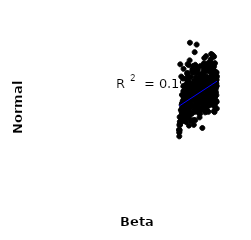
| Category | Series 0 |
|---|---|
| 36.957838073041316 | 774.494 |
| 36.73413787801686 | 627.892 |
| 40.55856776338242 | 749.544 |
| 40.180085610158194 | 779.877 |
| 40.958273129341016 | 832.307 |
| 36.17791340856428 | 646.233 |
| 38.91952385559631 | 577.009 |
| 43.84278715932486 | 740.854 |
| 37.82754029690867 | 639.082 |
| 41.71167236618707 | 674.128 |
| 40.65168179243187 | 740.859 |
| 43.09383148274357 | 726.689 |
| 42.837786823031756 | 778.202 |
| 40.18519002420041 | 654.74 |
| 39.76807695686399 | 609.296 |
| 39.95744905162754 | 718.578 |
| 41.95952358728956 | 648.875 |
| 42.38350325606751 | 707.442 |
| 40.410171363998145 | 788.634 |
| 41.928678543299924 | 744.595 |
| 40.57490333071664 | 674.608 |
| 40.78264026855993 | 734.386 |
| 43.22240591808958 | 631.546 |
| 35.93085898994363 | 643.633 |
| 38.446868280218666 | 857.381 |
| 43.50093430712034 | 727.508 |
| 41.80589098052988 | 704.56 |
| 36.60699470289444 | 628.615 |
| 36.247578561825705 | 657.765 |
| 40.74322138529889 | 697.331 |
| 39.62462825044211 | 663.845 |
| 39.40186644996382 | 753.634 |
| 41.86368607038498 | 579.779 |
| 37.595187947633555 | 891.676 |
| 39.715718838031705 | 614.426 |
| 36.38535866817008 | 541.601 |
| 40.14550794265751 | 856.465 |
| 35.902136657581146 | 552.156 |
| 41.16087466072507 | 654.455 |
| 37.248004167421975 | 687.217 |
| 37.66366518820395 | 999.563 |
| 41.36395450851588 | 573.206 |
| 40.69995918218085 | 718.231 |
| 38.22626948247785 | 692.555 |
| 41.711262308393344 | 665.877 |
| 42.20446371780627 | 613.667 |
| 37.38174490166034 | 862.778 |
| 37.84849338162252 | 738.433 |
| 43.501139959556156 | 750.719 |
| 37.35532458997686 | 551.413 |
| 39.54554478553708 | 834.441 |
| 43.19364282260736 | 663.537 |
| 38.07344216028033 | 749.045 |
| 43.72602675306581 | 733.985 |
| 42.26281651988968 | 676.805 |
| 42.853242216992044 | 734.247 |
| 42.08686120713884 | 825.522 |
| 42.695946991545995 | 683.137 |
| 37.078905005514535 | 814.492 |
| 42.32202676522556 | 729.429 |
| 37.79908419609508 | 669.674 |
| 39.445187749616906 | 735.844 |
| 43.62511823976846 | 667.926 |
| 35.16612879453058 | 499.237 |
| 36.620692616564995 | 665.543 |
| 38.687951451675765 | 830.56 |
| 43.400574914489724 | 812.123 |
| 38.643275176726675 | 691.127 |
| 37.12778827986923 | 709.698 |
| 36.44110630338175 | 612.051 |
| 41.36133583780589 | 741.121 |
| 37.964386779647114 | 562.684 |
| 38.25613266062817 | 714.434 |
| 35.09857129326781 | 466.673 |
| 39.577076577856026 | 700.037 |
| 36.977179848253066 | 669.985 |
| 39.095406659760854 | 631.91 |
| 44.03596446149483 | 643.774 |
| 42.84728195547852 | 633.641 |
| 41.893246390846414 | 644.787 |
| 40.39122651225615 | 654.773 |
| 43.417925402938025 | 832.536 |
| 43.34304917991875 | 700.417 |
| 41.257063927349115 | 667.228 |
| 42.20296408429495 | 849.463 |
| 37.5606226127974 | 657.965 |
| 40.16285571312524 | 747.171 |
| 43.05105210022031 | 619.642 |
| 39.310221721741215 | 677.282 |
| 42.754332421388554 | 818.721 |
| 38.21349018373465 | 711.397 |
| 43.279692380467175 | 740.291 |
| 43.109570567192236 | 653.709 |
| 37.68767647339638 | 754.305 |
| 43.860487166727474 | 729.745 |
| 43.88926938095051 | 757.984 |
| 36.07687476577011 | 703.245 |
| 43.27101235657523 | 658.937 |
| 41.32845079008771 | 649.112 |
| 39.185688317343896 | 644.377 |
| 38.938192650050254 | 669.954 |
| 40.553779354186624 | 749.416 |
| 35.084506204178616 | 448.77 |
| 41.065811990725344 | 755.817 |
| 42.58109035451129 | 781.876 |
| 39.50749853040549 | 772.189 |
| 38.42885732995284 | 817.153 |
| 39.700170836528315 | 653.509 |
| 40.70650418900333 | 691.69 |
| 37.422526972471566 | 491.987 |
| 43.33775738385186 | 800.377 |
| 39.26507702606579 | 636.303 |
| 37.76481509458541 | 689.779 |
| 41.273207941223596 | 855.255 |
| 42.96571382659635 | 791.736 |
| 39.434476384039534 | 819.547 |
| 36.6832251713813 | 584.841 |
| 42.03529480709012 | 686.007 |
| 38.40591013754763 | 655.153 |
| 40.583010636178905 | 673.947 |
| 36.384228126464805 | 737.296 |
| 36.423707491929015 | 550.042 |
| 43.86231853960876 | 734.275 |
| 37.25367391953498 | 556.562 |
| 39.10414021016505 | 789.173 |
| 38.3174971103948 | 675.672 |
| 40.16398626845907 | 762.114 |
| 36.124016948462845 | 839.773 |
| 38.93383357961649 | 525.405 |
| 37.17326794987309 | 612.782 |
| 40.66233721994436 | 477.639 |
| 42.68699682000165 | 711.702 |
| 39.741518489608076 | 667.912 |
| 36.51619533290319 | 637.304 |
| 41.78350824826111 | 583.617 |
| 39.10395621850005 | 607.273 |
| 41.73762787242122 | 691.306 |
| 39.19131791170026 | 751.661 |
| 42.18746657503842 | 747.216 |
| 41.558783757799816 | 696.586 |
| 44.05955513441707 | 677.868 |
| 42.44305048086967 | 882.705 |
| 37.9046803200867 | 623.583 |
| 37.037379389517895 | 603.983 |
| 41.29657243779511 | 661.585 |
| 36.63983131330514 | 736.321 |
| 44.093140727760144 | 817.4 |
| 41.9657401717641 | 773.498 |
| 38.1188367105444 | 656.526 |
| 35.28787278225834 | 497.551 |
| 42.561968679492225 | 733.077 |
| 35.91639709516671 | 586.655 |
| 43.7395142036737 | 667.16 |
| 40.700109238834926 | 675.271 |
| 37.19531667962378 | 567.929 |
| 42.96948867341759 | 810.687 |
| 41.31969945127589 | 653.032 |
| 42.53526982475266 | 850.383 |
| 41.208225459473475 | 731.298 |
| 39.91982173929158 | 782.763 |
| 36.95001768365364 | 686.715 |
| 37.16790528292376 | 776.412 |
| 39.88759164061399 | 586.604 |
| 40.788272044372654 | 644.011 |
| 43.8338791309893 | 760.35 |
| 35.60829604435241 | 543.132 |
| 35.46754735725728 | 587.637 |
| 40.79238243730751 | 696.71 |
| 43.606053728029586 | 574.746 |
| 39.2127507783719 | 735.577 |
| 38.720608072804644 | 605.448 |
| 37.29126077668024 | 724.469 |
| 39.942968349386845 | 674.062 |
| 42.52943282383599 | 636.12 |
| 37.154865246399694 | 570.348 |
| 41.42546195920174 | 725.945 |
| 37.153816391150514 | 802.673 |
| 37.476638611729584 | 721.067 |
| 41.7779588634302 | 790.513 |
| 40.63193618243059 | 672.364 |
| 35.13236429062151 | 457.082 |
| 38.810937724919675 | 941.723 |
| 38.57755100119899 | 527.344 |
| 43.32554792547313 | 864.962 |
| 41.06254943572123 | 662.084 |
| 42.846610128277845 | 746.066 |
| 38.53410425988763 | 721.818 |
| 36.974595999913035 | 752.023 |
| 44.014643358371636 | 783.203 |
| 40.01799984025999 | 681.542 |
| 38.92946891204099 | 665.741 |
| 36.16757969882796 | 571.975 |
| 40.14450471943479 | 696.818 |
| 39.2568000503387 | 662.382 |
| 43.312206651774574 | 720.726 |
| 37.460430276060144 | 537.299 |
| 36.746680296313215 | 589.042 |
| 36.099309598903005 | 567.602 |
| 41.16087993764492 | 675.074 |
| 40.88251706623713 | 862.497 |
| 37.76269095202199 | 571.774 |
| 37.416489296872854 | 587.584 |
| 40.9725038764539 | 817.516 |
| 41.708121783878504 | 760.985 |
| 41.59031948621275 | 702.401 |
| 38.34750636862993 | 648.697 |
| 35.33240381014199 | 867.416 |
| 36.27314864190615 | 570.827 |
| 42.66549468693245 | 897.256 |
| 36.51448076311155 | 584.898 |
| 42.62910032551689 | 634.957 |
| 36.62579998897557 | 565.057 |
| 42.40922306419261 | 837.575 |
| 42.856202925074456 | 765.606 |
| 40.58431964127533 | 742.831 |
| 40.18865109772507 | 721.386 |
| 36.66952480707237 | 780.012 |
| 36.18042958356092 | 734.544 |
| 40.55004272578994 | 648.618 |
| 42.87108154537655 | 735.517 |
| 37.213463274737244 | 539.553 |
| 41.41364023965251 | 845.991 |
| 39.31603363888584 | 652.393 |
| 35.992384784110165 | 780.476 |
| 35.15316411420964 | 493.667 |
| 41.00060597158744 | 872.79 |
| 38.7160348121657 | 692 |
| 35.089860264327406 | 467.844 |
| 35.223943175047516 | 516.821 |
| 42.65273011189676 | 675.409 |
| 40.201569557779955 | 631.024 |
| 41.194768617926506 | 593.53 |
| 35.96843821765967 | 678.663 |
| 39.194455613693485 | 748.485 |
| 36.03597591531286 | 574.97 |
| 41.75852689397796 | 860.765 |
| 40.43285893417104 | 603.823 |
| 43.443890856757996 | 740.843 |
| 42.30603220977778 | 751.364 |
| 41.04536497741496 | 727.513 |
| 41.965006232943395 | 747.278 |
| 40.886327663803115 | 755.013 |
| 42.531829060015724 | 845.44 |
| 36.374304787207315 | 652.225 |
| 37.48340666101596 | 632.931 |
| 38.86575438093225 | 736.594 |
| 42.02952365795702 | 773.116 |
| 36.10177689344006 | 556.603 |
| 39.15058847344311 | 760.28 |
| 40.29807240309161 | 661.502 |
| 41.503697955380275 | 767.455 |
| 36.13526133009367 | 549.651 |
| 39.28506548119767 | 988.175 |
| 40.80478731117977 | 615.738 |
| 39.04268234993979 | 613.869 |
| 37.95012314623806 | 517.534 |
| 42.80049688232977 | 930.803 |
| 39.99276041857476 | 542.414 |
| 43.62434137087912 | 716.353 |
| 42.40759314116866 | 700.357 |
| 41.21159412302564 | 631.881 |
| 40.93394676624756 | 768.099 |
| 43.14649363037415 | 924.513 |
| 41.162884194382755 | 778.839 |
| 40.77592528839903 | 714.059 |
| 37.19962428986178 | 722.913 |
| 40.478944654899756 | 797.989 |
| 36.86805202187786 | 708.578 |
| 43.87903743642583 | 713.062 |
| 39.40935145984685 | 812.34 |
| 43.96074934152868 | 695.603 |
| 37.10899881274693 | 868.714 |
| 43.28157453439342 | 913.936 |
| 35.73526863832421 | 629.062 |
| 43.27090948276141 | 838.375 |
| 37.787680796917996 | 664.585 |
| 38.89894763942761 | 772.339 |
| 40.18987665102994 | 800.776 |
| 36.556891585703674 | 575.545 |
| 36.85484988908901 | 606.787 |
| 39.49126731302464 | 691.156 |
| 42.66688218243022 | 666.959 |
| 39.15684240884471 | 679.121 |
| 43.23152288674697 | 730.606 |
| 40.858531232541665 | 805.703 |
| 36.18585953261664 | 602.156 |
| 41.729715945428886 | 689.497 |
| 41.765913894320114 | 850.166 |
| 37.847923943048954 | 788.646 |
| 44.052625587353305 | 749.837 |
| 39.347121806756576 | 618.559 |
| 42.26311650927357 | 729.533 |
| 42.058312724870504 | 750.031 |
| 38.02183196460667 | 677.174 |
| 40.621652290466095 | 598.592 |
| 41.31538164959549 | 732.555 |
| 39.92605817163807 | 641.086 |
| 42.39890016498693 | 661.474 |
| 41.78777910905401 | 871.347 |
| 37.08217284277248 | 654.519 |
| 42.91339221608896 | 839.613 |
| 40.95255859168638 | 803.46 |
| 40.781108262048015 | 728.291 |
| 41.35390839400636 | 618.157 |
| 38.71355791120979 | 591.699 |
| 36.39051326236668 | 595.946 |
| 38.15928524511432 | 697.039 |
| 39.81115357078941 | 625.777 |
| 39.8710296785751 | 669.551 |
| 43.805281659664004 | 594.039 |
| 36.30635297971046 | 640.585 |
| 40.680404410671116 | 648.5 |
| 41.351782308806236 | 851.169 |
| 39.86010007211192 | 710.1 |
| 42.2332638796498 | 728.089 |
| 42.84167056893278 | 743.419 |
| 39.370037889318645 | 742.616 |
| 36.00223314718096 | 551.183 |
| 43.8210684801004 | 725.84 |
| 41.81557184236503 | 612.441 |
| 39.75530177375035 | 704.463 |
| 36.25112302214021 | 662.149 |
| 39.45582345377201 | 583.002 |
| 41.463997448935714 | 661.183 |
| 39.2201067523091 | 722.885 |
| 37.365249410976155 | 664.516 |
| 35.89775067429996 | 587.468 |
| 36.641790512531905 | 550.668 |
| 40.36208197394835 | 665.184 |
| 41.86775087133227 | 732.93 |
| 41.558952716743065 | 917.451 |
| 43.43836550009181 | 579.844 |
| 43.878033534679815 | 750.519 |
| 41.03397429943303 | 673.134 |
| 35.18244373422037 | 544.928 |
| 43.807478469250576 | 683.617 |
| 35.58471551093807 | 533.754 |
| 39.876874201667384 | 665.896 |
| 44.00874341549239 | 783.719 |
| 36.01920203644587 | 594.925 |
| 35.66337179368971 | 619.169 |
| 38.609470589644026 | 719.866 |
| 39.28130895543983 | 631.341 |
| 37.925384658106346 | 613.549 |
| 43.192652999140776 | 775.591 |
| 38.28056620496834 | 569.899 |
| 38.83696736111568 | 677.051 |
| 36.837208959794154 | 558.564 |
| 40.07659082994325 | 563.24 |
| 42.89833970253272 | 707.722 |
| 42.317612505034 | 665.396 |
| 38.24220724191534 | 692.565 |
| 44.109593458658246 | 771.771 |
| 37.7326762385958 | 623.327 |
| 42.79833435351747 | 663.21 |
| 41.54307260545026 | 632.449 |
| 40.58694263405149 | 591.912 |
| 39.76735635082342 | 649.038 |
| 36.09900045715171 | 732.309 |
| 41.08657606026061 | 708.554 |
| 43.694910863546305 | 772.433 |
| 40.99550304476273 | 776.419 |
| 36.16331964904035 | 520.594 |
| 43.69900852349506 | 610.292 |
| 38.92141515215531 | 643.75 |
| 37.66401084199093 | 602.192 |
| 35.69203494009881 | 573.751 |
| 36.164823397726266 | 660.94 |
| 43.323322505252285 | 705.351 |
| 41.947382618847854 | 651.338 |
| 43.143806226402766 | 818.416 |
| 41.13543111299146 | 906.047 |
| 42.14165312766336 | 576.719 |
| 38.526977667770254 | 655.163 |
| 41.408937119112146 | 714.266 |
| 39.99325757371059 | 746.308 |
| 38.266840530751686 | 727.886 |
| 40.5537030056818 | 702.676 |
| 36.719996873468794 | 615.983 |
| 35.72992524381144 | 680.2 |
| 42.321869233915244 | 839.719 |
| 41.14379721877225 | 773.679 |
| 38.573383116048944 | 718.041 |
| 35.81257150133184 | 562.331 |
| 44.18805151854089 | 794.064 |
| 43.6797849932851 | 806.154 |
| 43.55947231710517 | 720.993 |
| 43.130438031133764 | 830.224 |
| 38.28224873420545 | 842.209 |
| 43.22200671928573 | 844.773 |
| 42.78812932834071 | 690.453 |
| 41.22415380022831 | 781.618 |
| 42.900252513903936 | 740.002 |
| 41.32277582357729 | 823.323 |
| 38.849423694290955 | 646.768 |
| 38.581413791570576 | 653.817 |
| 40.28478218038936 | 717.624 |
| 39.36931545209403 | 635.865 |
| 36.98454347820279 | 811.713 |
| 41.232361681756196 | 596.286 |
| 39.60038106010151 | 747.702 |
| 39.98605558731978 | 768.339 |
| 41.93565410060808 | 640.838 |
| 42.259507432045524 | 705.535 |
| 39.9130535903258 | 709.829 |
| 41.8263616259828 | 723.819 |
| 38.60491693859662 | 496.585 |
| 40.681693550612366 | 682.084 |
| 42.383266560810604 | 678.617 |
| 35.57347677385161 | 792.385 |
| 38.67173868216426 | 748.339 |
| 38.909690419307864 | 619.136 |
| 35.85967478539807 | 547.179 |
| 40.06598176465941 | 748.99 |
| 43.20470494439777 | 692.09 |
| 44.126870223039674 | 637 |
| 38.975196216137114 | 687.709 |
| 43.945726314471656 | 724.995 |
| 41.55976607366692 | 731.806 |
| 39.37247327353849 | 851.081 |
| 39.1803776329904 | 675.662 |
| 37.17212577502679 | 650.772 |
| 37.2172738677955 | 713.472 |
| 40.52996990641054 | 663.265 |
| 38.34989482192138 | 815.863 |
| 35.125556692194955 | 465.59 |
| 42.41658098123786 | 751.727 |
| 35.90186187328552 | 552.696 |
| 41.148233167304745 | 847.965 |
| 37.02850423456617 | 596.975 |
| 38.95133823460322 | 864.616 |
| 37.371411843519965 | 589.289 |
| 39.80095117701015 | 569.434 |
| 38.65871117381025 | 698.469 |
| 42.30478038013842 | 662.487 |
| 40.29995474971123 | 711.213 |
| 36.76630216787203 | 513.431 |
| 43.047389400408974 | 679.798 |
| 36.522990141082445 | 625.459 |
| 44.15237633891907 | 596.245 |
| 38.223115638190556 | 828.762 |
| 35.79360550569079 | 566.411 |
| 43.59553857870975 | 646.103 |
| 43.704193613643355 | 627.256 |
| 36.73949242327851 | 595.264 |
| 40.10579839970176 | 579.893 |
| 44.14289730049567 | 734.505 |
| 36.12280311085328 | 559.954 |
| 42.1290889535109 | 635.887 |
| 40.22343304259084 | 676.062 |
| 39.604195654410105 | 655.631 |
| 38.242556425333525 | 723.488 |
| 35.77699188127955 | 600.447 |
| 35.78091741934094 | 590.96 |
| 42.59182420832607 | 791.168 |
| 37.24540110262415 | 661.677 |
| 42.48749453754079 | 663.165 |
| 40.050666257758934 | 746.317 |
| 39.45745436744805 | 646.839 |
| 40.7888774821357 | 632.759 |
| 43.5005752114782 | 914.545 |
| 42.907174930858574 | 772.681 |
| 43.03609425294558 | 691.481 |
| 39.49210367921679 | 727.042 |
| 38.89623182778671 | 676.181 |
| 42.69805067730404 | 878.477 |
| 43.99117132414004 | 818.919 |
| 39.58297107140989 | 702.795 |
| 43.3654877891354 | 727.18 |
| 39.34016370563581 | 684.813 |
| 39.447088489107536 | 680.591 |
| 39.43614736717782 | 637.253 |
| 41.51969621260463 | 847.726 |
| 43.49846979590119 | 854.633 |
| 36.73322044434845 | 641.726 |
| 40.30009053238747 | 807.459 |
| 41.50338377621385 | 601.382 |
| 43.49389074829362 | 763.098 |
| 38.471105442877196 | 610.153 |
| 37.4215001145481 | 757.067 |
| 37.067780785892175 | 770.009 |
| 42.19189881825432 | 762.783 |
| 43.72850526446639 | 761.235 |
| 40.81578724476605 | 764.826 |
| 43.87897388754787 | 757.994 |
| 42.30623508806761 | 622.526 |
| 43.267163159627074 | 735.871 |
| 42.865143081372736 | 765.859 |
| 40.593286622228376 | 624.595 |
| 35.09376171700671 | 426.489 |
| 36.7884287009829 | 557.275 |
| 39.05995144147009 | 598.463 |
| 42.02768363548354 | 779.385 |
| 40.45662197904049 | 722.392 |
| 36.49006398832827 | 537.163 |
| 35.32629070873715 | 510.374 |
| 39.55875008897294 | 662.621 |
| 36.048020194926536 | 585.877 |
| 43.717178585233576 | 874.468 |
| 41.10597703238163 | 672.879 |